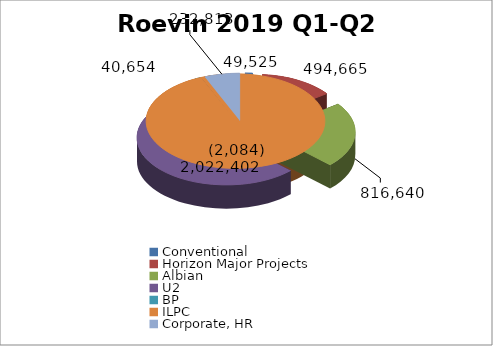
| Category | 2019 - Q2 | 2017 | 2018 | GRAND TOTAL |
|---|---|---|---|---|
| Conventional | 49525 | 86396.2 | 128219.96 |  |
| Horizon Major Projects | 494665 | 1270171.31 | 872993.08 |  |
| Albian  | 816640 | 505280.33 | 1619920.12 |  |
| U2 | 2022402 | 8749335.17 | 7883831.04 |  |
| BP | 40654 | 29760.48 | 2184 |  |
| ILPC | -2084 | 199183.94 | 105430.87 |  |
| Corporate, HR | 232813 | 173804.3 | 829877.04 |  |